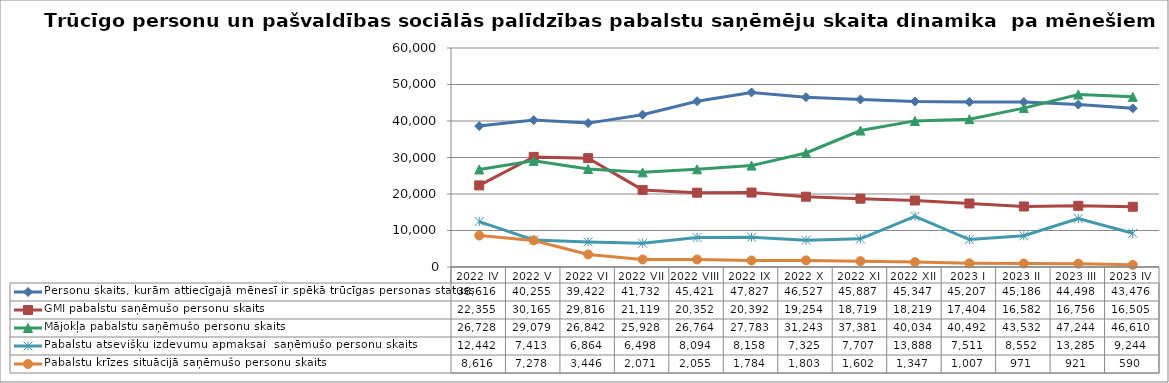
| Category | Personu skaits, kurām attiecīgajā mēnesī ir spēkā trūcīgas personas statuss | GMI pabalstu saņēmušo personu skaits | Mājokļa pabalstu saņēmušo personu skaits | Pabalstu atsevišķu izdevumu apmaksai  saņēmušo personu skaits | Pabalstu krīzes situācijā saņēmušo personu skaits |
|---|---|---|---|---|---|
| 2022 IV | 38616 | 22355 | 26728 | 12442 | 8616 |
| 2022 V | 40255 | 30165 | 29079 | 7413 | 7278 |
| 2022 VI | 39422 | 29816 | 26842 | 6864 | 3446 |
| 2022 VII | 41732 | 21119 | 25928 | 6498 | 2071 |
| 2022 VIII | 45421 | 20352 | 26764 | 8094 | 2055 |
| 2022 IX | 47827 | 20392 | 27783 | 8158 | 1784 |
| 2022 X | 46527 | 19254 | 31243 | 7325 | 1803 |
| 2022 XI | 45887 | 18719 | 37381 | 7707 | 1602 |
| 2022 XII | 45347 | 18219 | 40034 | 13888 | 1347 |
| 2023 I | 45207 | 17404 | 40492 | 7511 | 1007 |
| 2023 II | 45186 | 16582 | 43532 | 8552 | 971 |
| 2023 III | 44498 | 16756 | 47244 | 13285 | 921 |
| 2023 IV | 43476 | 16505 | 46610 | 9244 | 590 |